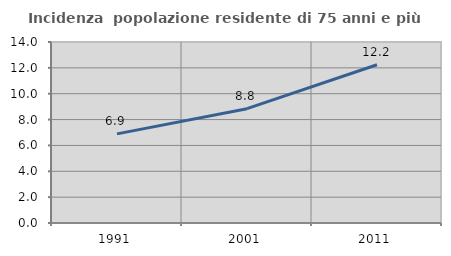
| Category | Incidenza  popolazione residente di 75 anni e più |
|---|---|
| 1991.0 | 6.894 |
| 2001.0 | 8.841 |
| 2011.0 | 12.243 |